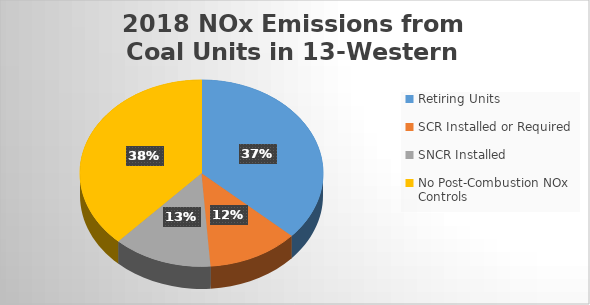
| Category | 2018 NOx Emissions |
|---|---|
| Retiring Units | 66860.71 |
| SCR Installed or Required | 21980.297 |
| SNCR Installed | 23928.16 |
| No Post-Combustion NOx Controls | 69206.444 |